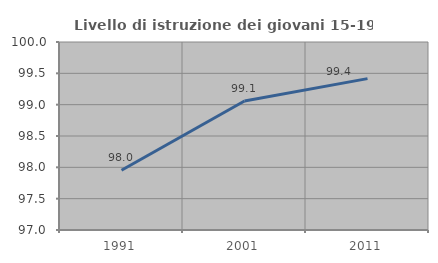
| Category | Livello di istruzione dei giovani 15-19 anni |
|---|---|
| 1991.0 | 97.954 |
| 2001.0 | 99.06 |
| 2011.0 | 99.415 |